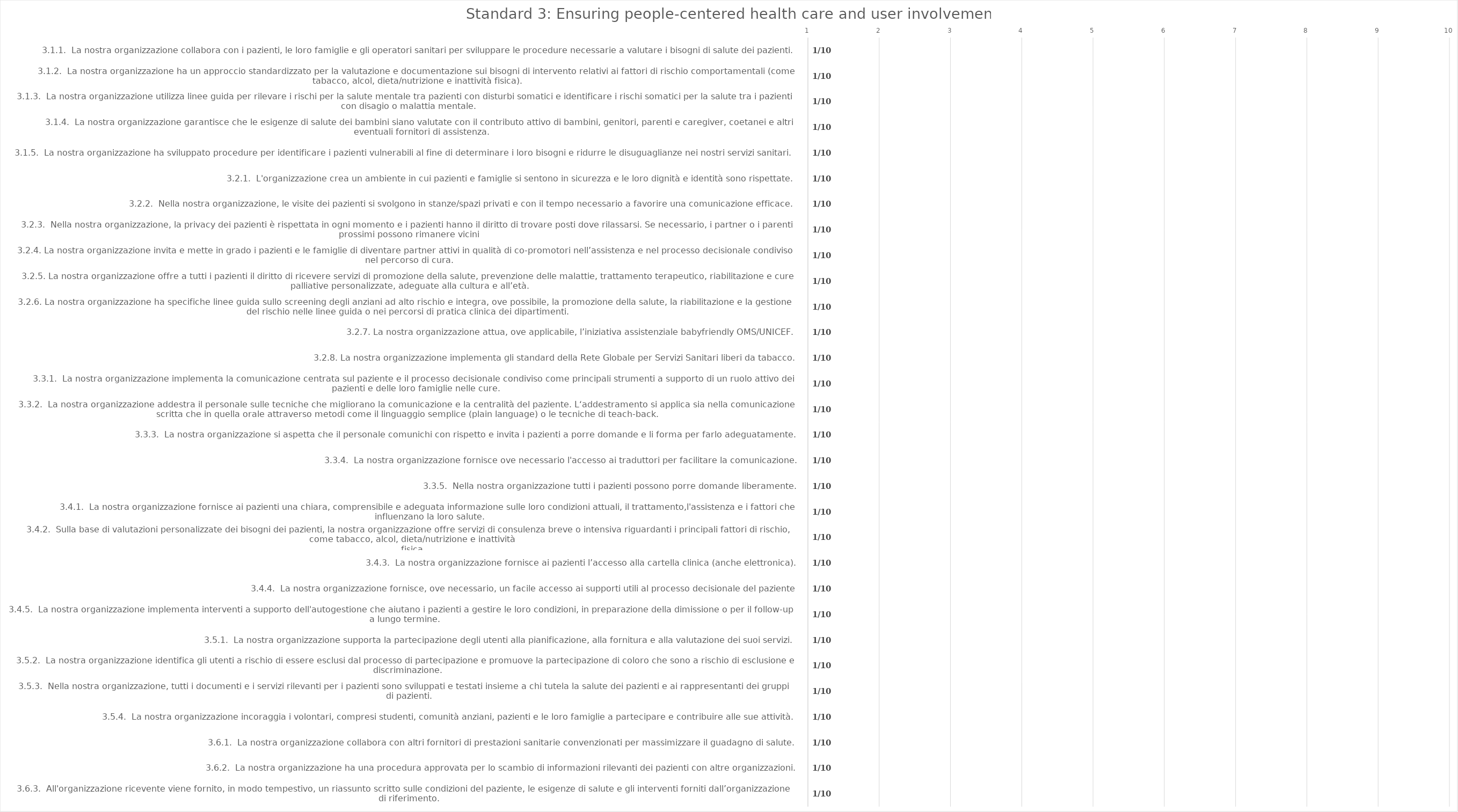
| Category | value |
|---|---|
| 3.1.1.  La nostra organizzazione collabora con i pazienti, le loro famiglie e gli operatori sanitari per sviluppare le procedure necessarie a valutare i bisogni di salute dei pazienti. | 1 |
| 3.1.2.  La nostra organizzazione ha un approccio standardizzato per la valutazione e documentazione sui bisogni di intervento relativi ai fattori di rischio comportamentali (come tabacco, alcol, dieta/nutrizione e inattività fisica). | 1 |
| 3.1.3.  La nostra organizzazione utilizza linee guida per rilevare i rischi per la salute mentale tra pazienti con disturbi somatici e identificare i rischi somatici per la salute tra i pazienti con disagio o malattia mentale. | 1 |
| 3.1.4.  La nostra organizzazione garantisce che le esigenze di salute dei bambini siano valutate con il contributo attivo di bambini, genitori, parenti e caregiver, coetanei e altri eventuali fornitori di assistenza. | 1 |
| 3.1.5.  La nostra organizzazione ha sviluppato procedure per identificare i pazienti vulnerabili al fine di determinare i loro bisogni e ridurre le disuguaglianze nei nostri servizi sanitari. | 1 |
| 3.2.1.  L'organizzazione crea un ambiente in cui pazienti e famiglie si sentono in sicurezza e le loro dignità e identità sono rispettate. | 1 |
| 3.2.2.  Nella nostra organizzazione, le visite dei pazienti si svolgono in stanze/spazi privati e con il tempo necessario a favorire una comunicazione efficace. | 1 |
| 3.2.3.  Nella nostra organizzazione, la privacy dei pazienti è rispettata in ogni momento e i pazienti hanno il diritto di trovare posti dove rilassarsi. Se necessario, i partner o i parenti prossimi possono rimanere vicini  | 1 |
| 3.2.4. La nostra organizzazione invita e mette in grado i pazienti e le famiglie di diventare partner attivi in qualità di co-promotori nell’assistenza e nel processo decisionale condiviso nel percorso di cura. | 1 |
| 3.2.5. La nostra organizzazione offre a tutti i pazienti il diritto di ricevere servizi di promozione della salute, prevenzione delle malattie, trattamento terapeutico, riabilitazione e cure palliative personalizzate, adeguate alla cultura e all’età. | 1 |
| 3.2.6. La nostra organizzazione ha specifiche linee guida sullo screening degli anziani ad alto rischio e integra, ove possibile, la promozione della salute, la riabilitazione e la gestione del rischio nelle linee guida o nei percorsi di pratica clinica d | 1 |
| 3.2.7. La nostra organizzazione attua, ove applicabile, l’iniziativa assistenziale babyfriendly OMS/UNICEF. | 1 |
| 3.2.8. La nostra organizzazione implementa gli standard della Rete Globale per Servizi Sanitari liberi da tabacco. | 1 |
| 3.3.1.  La nostra organizzazione implementa la comunicazione centrata sul paziente e il processo decisionale condiviso come principali strumenti a supporto di un ruolo attivo dei pazienti e delle loro famiglie nelle cure. | 1 |
| 3.3.2.  La nostra organizzazione addestra il personale sulle tecniche che migliorano la comunicazione e la centralità del paziente. L‘addestramento si applica sia nella comunicazione scritta che in quella orale attraverso metodi come il linguaggio semplic | 1 |
| 3.3.3.  La nostra organizzazione si aspetta che il personale comunichi con rispetto e invita i pazienti a porre domande e li forma per farlo adeguatamente. | 1 |
| 3.3.4.  La nostra organizzazione fornisce ove necessario l'accesso ai traduttori per facilitare la comunicazione. | 1 |
| 3.3.5.  Nella nostra organizzazione tutti i pazienti possono porre domande liberamente. | 1 |
| 3.4.1.  La nostra organizzazione fornisce ai pazienti una chiara, comprensibile e adeguata informazione sulle loro condizioni attuali, il trattamento,l'assistenza e i fattori che influenzano la loro salute. | 1 |
| 3.4.2.  Sulla base di valutazioni personalizzate dei bisogni dei pazienti, la nostra organizzazione offre servizi di consulenza breve o intensiva riguardanti i principali fattori di rischio, come tabacco, alcol, dieta/nutrizione e inattività
fisica. | 1 |
| 3.4.3.  La nostra organizzazione fornisce ai pazienti l’accesso alla cartella clinica (anche elettronica). | 1 |
| 3.4.4.  La nostra organizzazione fornisce, ove necessario, un facile accesso ai supporti utili al processo decisionale del paziente | 1 |
| 3.4.5.  La nostra organizzazione implementa interventi a supporto dell'autogestione che aiutano i pazienti a gestire le loro condizioni, in preparazione della dimissione o per il follow-up a lungo termine. | 1 |
| 3.5.1.  La nostra organizzazione supporta la partecipazione degli utenti alla pianificazione, alla fornitura e alla valutazione dei suoi servizi. | 1 |
| 3.5.2.  La nostra organizzazione identifica gli utenti a rischio di essere esclusi dal processo di partecipazione e promuove la partecipazione di coloro che sono a rischio di esclusione e discriminazione. | 1 |
| 3.5.3.  Nella nostra organizzazione, tutti i documenti e i servizi rilevanti per i pazienti sono sviluppati e testati insieme a chi tutela la salute dei pazienti e ai rappresentanti dei gruppi di pazienti. | 1 |
| 3.5.4.  La nostra organizzazione incoraggia i volontari, compresi studenti, comunità anziani, pazienti e le loro famiglie a partecipare e contribuire alle sue attività. | 1 |
| 3.6.1.  La nostra organizzazione collabora con altri fornitori di prestazioni sanitarie convenzionati per massimizzare il guadagno di salute. | 1 |
| 3.6.2.  La nostra organizzazione ha una procedura approvata per lo scambio di informazioni rilevanti dei pazienti con altre organizzazioni. | 1 |
| 3.6.3.  All'organizzazione ricevente viene fornito, in modo tempestivo, un riassunto scritto sulle condizioni del paziente, le esigenze di salute e gli interventi forniti dall’organizzazione di riferimento. | 1 |